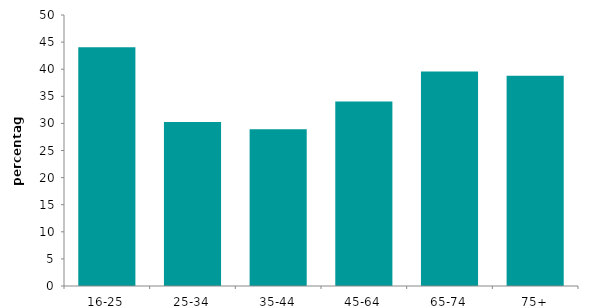
| Category | Series 0 |
|---|---|
| 16-25 | 44.064 |
| 25-34 | 30.26 |
| 35-44 | 28.908 |
| 45-64 | 34.047 |
| 65-74 | 39.592 |
| 75+ | 38.769 |